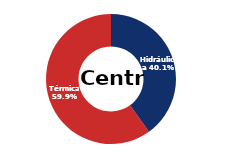
| Category | Centro |
|---|---|
| Eólica | 0 |
| Hidráulica | 1568.686 |
| Solar | 0.006 |
| Térmica | 2346.893 |